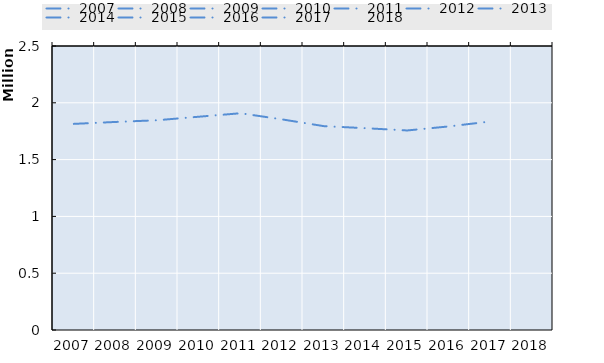
| Category | poor working-age individuals (right) |
|---|---|
| 2007.0 | 1814455.25 |
| 2008.0 | 1831403.125 |
| 2009.0 | 1846570.625 |
| 2010.0 | 1877396.75 |
| 2011.0 | 1908076 |
| 2012.0 | 1853794.5 |
| 2013.0 | 1794518.25 |
| 2014.0 | 1776449.25 |
| 2015.0 | 1756441.25 |
| 2016.0 | 1792125.25 |
| 2017.0 | 1835510.625 |
| 2018.0 | 0 |